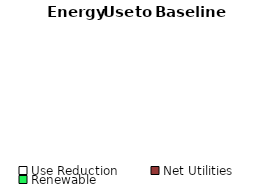
| Category | Series 0 |
|---|---|
| Use Reduction | 0 |
| Net Utilities | 0 |
| Renewable | 0 |